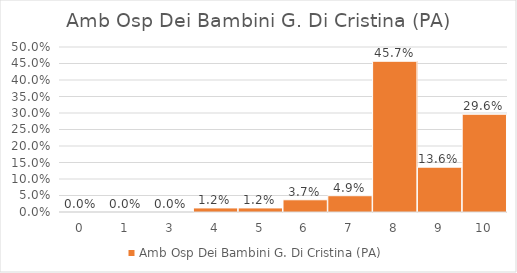
| Category | Amb Osp Dei Bambini G. Di Cristina (PA) |
|---|---|
| 0.0 | 0 |
| 1.0 | 0 |
| 3.0 | 0 |
| 4.0 | 0.012 |
| 5.0 | 0.012 |
| 6.0 | 0.037 |
| 7.0 | 0.049 |
| 8.0 | 0.457 |
| 9.0 | 0.136 |
| 10.0 | 0.296 |